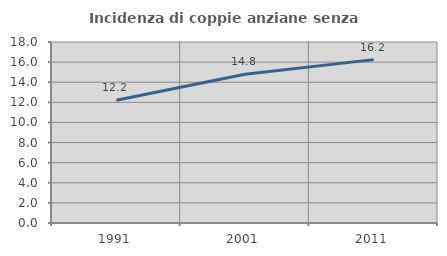
| Category | Incidenza di coppie anziane senza figli  |
|---|---|
| 1991.0 | 12.202 |
| 2001.0 | 14.794 |
| 2011.0 | 16.246 |